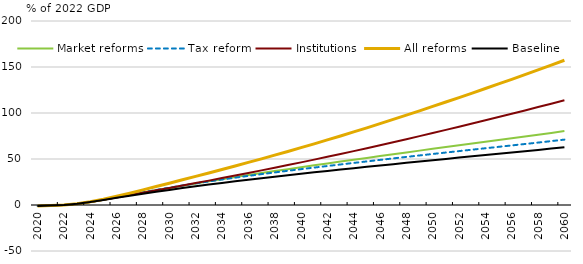
| Category | Market reforms | Tax reform | Institutions | All reforms | Baseline |
|---|---|---|---|---|---|
| 2020.0 | -1.056 | -1.056 | -1.056 | -1.056 | -1.056 |
| 2021.0 | -0.639 | -0.639 | -0.639 | -0.639 | -0.639 |
| 2022.0 | 0 | 0 | 0 | 0 | 0 |
| 2023.0 | 1.379 | 1.398 | 1.374 | 1.403 | 1.374 |
| 2024.0 | 3.352 | 3.395 | 3.342 | 3.546 | 3.275 |
| 2025.0 | 5.719 | 5.82 | 5.692 | 6.287 | 5.486 |
| 2026.0 | 8.272 | 8.466 | 8.216 | 9.444 | 7.791 |
| 2027.0 | 10.874 | 11.158 | 10.78 | 12.854 | 10.054 |
| 2028.0 | 13.479 | 13.798 | 13.347 | 16.422 | 12.235 |
| 2029.0 | 16.028 | 16.354 | 15.923 | 20.044 | 14.339 |
| 2030.0 | 18.525 | 18.813 | 18.522 | 23.701 | 16.377 |
| 2031.0 | 20.976 | 21.174 | 21.152 | 27.385 | 18.358 |
| 2032.0 | 23.381 | 23.438 | 23.815 | 31.095 | 20.286 |
| 2033.0 | 25.738 | 25.611 | 26.512 | 34.834 | 22.16 |
| 2034.0 | 28.047 | 27.7 | 29.241 | 38.606 | 23.981 |
| 2035.0 | 30.308 | 29.713 | 32.001 | 42.419 | 25.75 |
| 2036.0 | 32.525 | 31.659 | 34.793 | 46.279 | 27.469 |
| 2037.0 | 34.701 | 33.548 | 37.618 | 50.193 | 29.142 |
| 2038.0 | 36.842 | 35.387 | 40.48 | 54.165 | 30.774 |
| 2039.0 | 38.951 | 37.184 | 43.38 | 58.202 | 32.371 |
| 2040.0 | 41.034 | 38.944 | 46.323 | 62.305 | 33.938 |
| 2041.0 | 43.096 | 40.675 | 49.311 | 66.479 | 35.48 |
| 2042.0 | 45.14 | 42.381 | 52.346 | 70.723 | 37.002 |
| 2043.0 | 47.169 | 44.065 | 55.428 | 75.04 | 38.506 |
| 2044.0 | 49.185 | 45.732 | 58.558 | 79.427 | 39.995 |
| 2045.0 | 51.19 | 47.384 | 61.737 | 83.886 | 41.472 |
| 2046.0 | 53.186 | 49.025 | 64.963 | 88.416 | 42.94 |
| 2047.0 | 55.172 | 50.653 | 68.233 | 93.011 | 44.398 |
| 2048.0 | 57.146 | 52.269 | 71.543 | 97.666 | 45.845 |
| 2049.0 | 59.108 | 53.87 | 74.888 | 102.374 | 47.279 |
| 2050.0 | 61.055 | 55.456 | 78.266 | 107.131 | 48.701 |
| 2051.0 | 62.991 | 57.028 | 81.675 | 111.935 | 50.112 |
| 2052.0 | 64.915 | 58.588 | 85.113 | 116.782 | 51.512 |
| 2053.0 | 66.83 | 60.137 | 88.58 | 121.672 | 52.905 |
| 2054.0 | 68.737 | 61.676 | 92.076 | 126.602 | 54.291 |
| 2055.0 | 70.64 | 63.212 | 95.604 | 131.576 | 55.675 |
| 2056.0 | 72.548 | 64.75 | 99.17 | 136.6 | 57.064 |
| 2057.0 | 74.464 | 66.295 | 102.775 | 141.674 | 58.462 |
| 2058.0 | 76.399 | 67.855 | 106.427 | 146.808 | 59.877 |
| 2059.0 | 78.362 | 69.442 | 110.139 | 152.014 | 61.32 |
| 2060.0 | 80.367 | 71.067 | 113.924 | 157.311 | 62.802 |